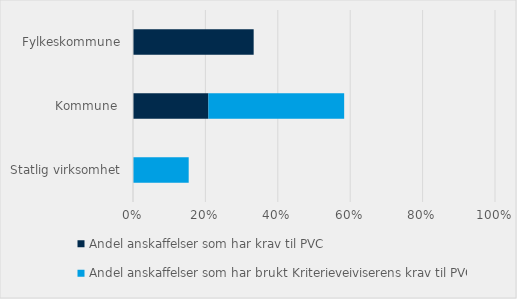
| Category | Andel anskaffelser som har krav til PVC | Andel anskaffelser som har brukt Kriterieveiviserens krav til PVC |
|---|---|---|
| Statlig virksomhet | 0 | 0.154 |
| Kommune  | 0.208 | 0.375 |
| Fylkeskommune | 0.333 | 0 |